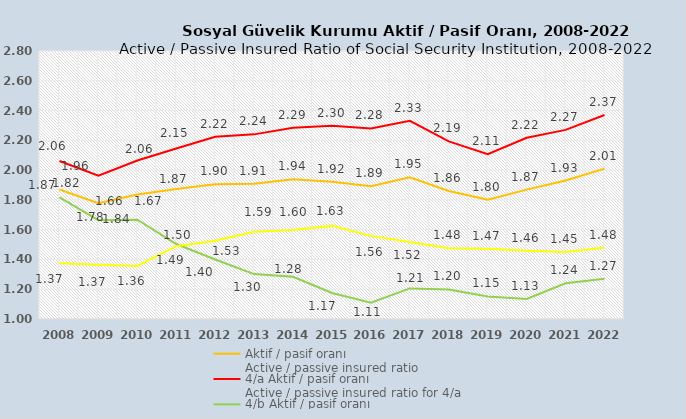
| Category | Aktif / pasif oranı
Active / passive insured ratio | 4/a Aktif / pasif oranı
Active / passive insured ratio for 4/a | 4/b Aktif / pasif oranı
Active / passive insured ratio for 4/b | 4/c Aktif / pasif oranı
Active / passive insured ratio for 4/c |
|---|---|---|---|---|
| 2008.0 | 1.869 | 2.061 | 1.816 | 1.374 |
| 2009.0 | 1.778 | 1.962 | 1.664 | 1.365 |
| 2010.0 | 1.836 | 2.064 | 1.667 | 1.356 |
| 2011.0 | 1.873 | 2.146 | 1.503 | 1.489 |
| 2012.0 | 1.905 | 2.224 | 1.4 | 1.526 |
| 2013.0 | 1.909 | 2.24 | 1.302 | 1.586 |
| 2014.0 | 1.938 | 2.285 | 1.284 | 1.598 |
| 2015.0 | 1.922 | 2.298 | 1.175 | 1.625 |
| 2016.0 | 1.892 | 2.28 | 1.109 | 1.558 |
| 2017.0 | 1.951 | 2.331 | 1.206 | 1.517 |
| 2018.0 | 1.86 | 2.193 | 1.199 | 1.475 |
| 2019.0 | 1.801 | 2.107 | 1.151 | 1.471 |
| 2020.0 | 1.869 | 2.217 | 1.135 | 1.459 |
| 2021.0 | 1.93 | 2.27 | 1.24 | 1.45 |
| 2022.0 | 2.01 | 2.37 | 1.27 | 1.48 |